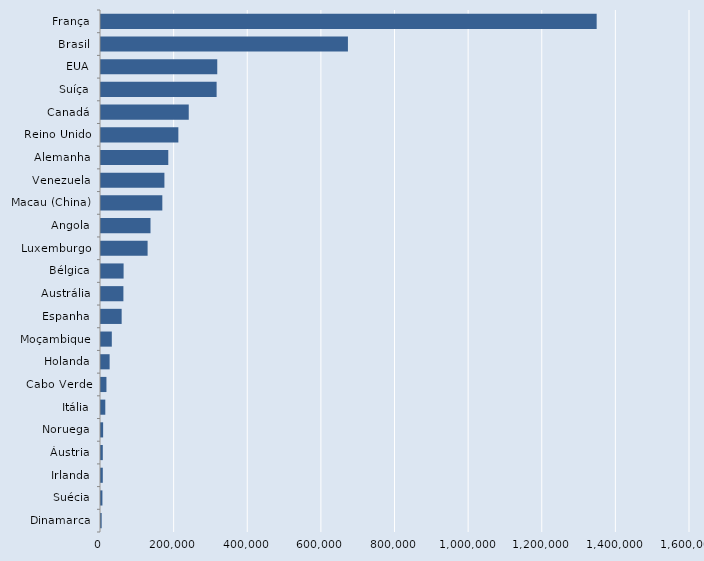
| Category | Series 0 |
|---|---|
| Dinamarca | 1784 |
| Suécia | 3859 |
| Irlanda | 4879 |
| Áustria | 4883 |
| Noruega | 5775 |
| Itália | 11673 |
| Cabo Verde | 14795 |
| Holanda | 23409 |
| Moçambique | 29360 |
| Espanha | 56104 |
| Austrália | 60860 |
| Bélgica | 61376 |
| Luxemburgo | 126602 |
| Angola | 134473 |
| Macau (China) | 166593 |
| Venezuela | 172266 |
| Alemanha | 182762 |
| Reino Unido | 210124 |
| Canadá | 238369 |
| Suíça | 314081 |
| EUA | 315808 |
| Brasil | 670760 |
| França | 1346472 |